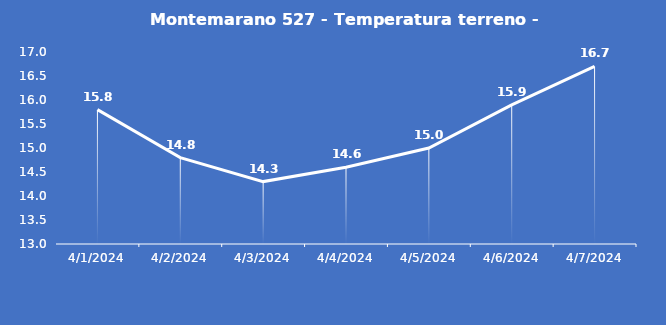
| Category | Montemarano 527 - Temperatura terreno - Grezzo (°C) |
|---|---|
| 4/1/24 | 15.8 |
| 4/2/24 | 14.8 |
| 4/3/24 | 14.3 |
| 4/4/24 | 14.6 |
| 4/5/24 | 15 |
| 4/6/24 | 15.9 |
| 4/7/24 | 16.7 |